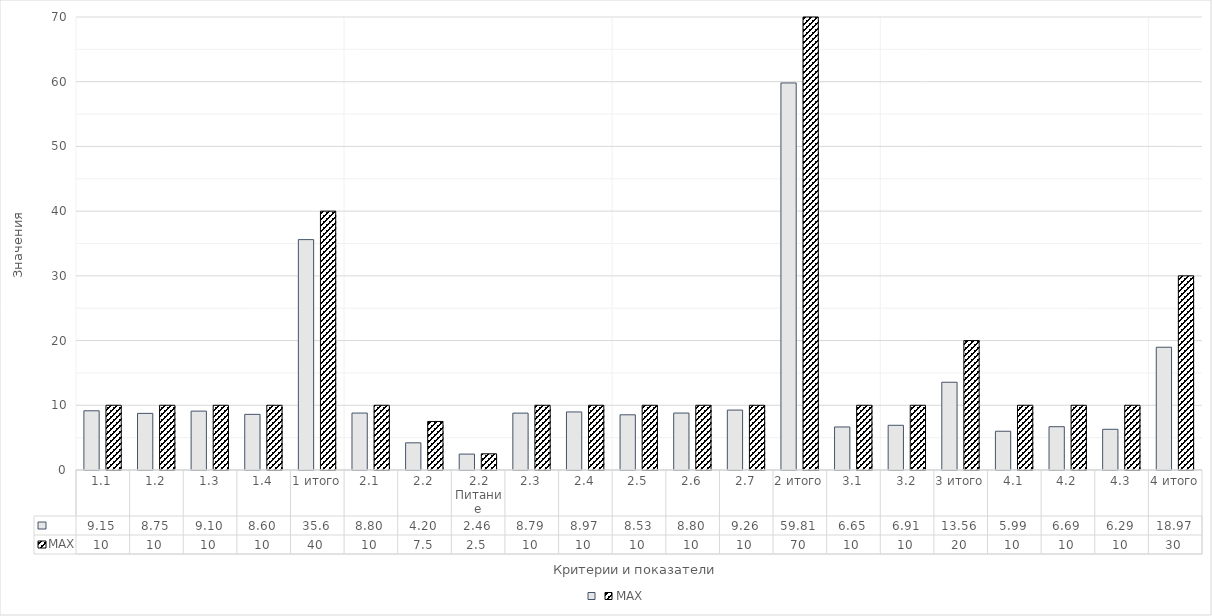
| Category | Series 101 | MAX |
|---|---|---|
| 1.1 | 9.15 | 10 |
| 1.2 | 8.75 | 10 |
| 1.3 | 9.1 | 10 |
| 1.4 | 8.6 | 10 |
| 1 итого | 35.6 | 40 |
| 2.1 | 8.8 | 10 |
| 2.2 | 4.2 | 7.5 |
| 2.2 Питание | 2.46 | 2.5 |
| 2.3 | 8.79 | 10 |
| 2.4 | 8.97 | 10 |
| 2.5 | 8.53 | 10 |
| 2.6 | 8.8 | 10 |
| 2.7 | 9.26 | 10 |
| 2 итого | 59.81 | 70 |
| 3.1 | 6.65 | 10 |
| 3.2 | 6.91 | 10 |
| 3 итого | 13.56 | 20 |
| 4.1 | 5.99 | 10 |
| 4.2 | 6.69 | 10 |
| 4.3 | 6.29 | 10 |
| 4 итого | 18.97 | 30 |